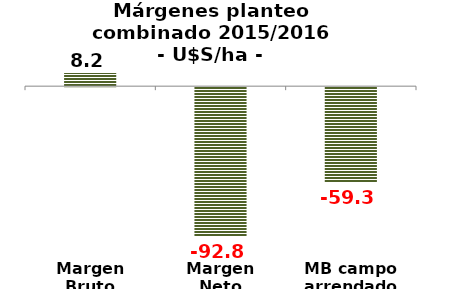
| Category | Series 0 |
|---|---|
| Margen Bruto | 8.211 |
| Margen Neto | -92.839 |
| MB campo arrendado | -59.259 |